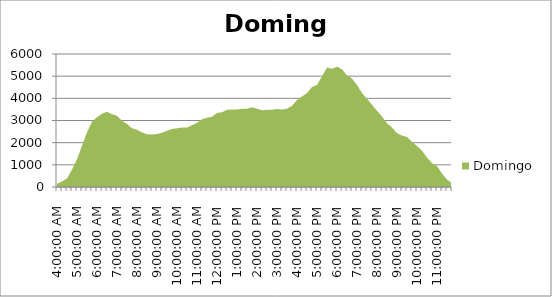
| Category | Domingo |
|---|---|
| 0.16666666666666663 | 151 |
| 0.1770833333333333 | 248 |
| 0.18749999999999994 | 382 |
| 0.1979166666666666 | 788 |
| 0.20833333333333326 | 1255 |
| 0.21874999999999992 | 1865 |
| 0.22916666666666657 | 2467 |
| 0.23958333333333323 | 2938 |
| 0.2499999999999999 | 3149 |
| 0.2604166666666666 | 3304 |
| 0.27083333333333326 | 3391 |
| 0.28124999999999994 | 3285 |
| 0.29166666666666663 | 3216 |
| 0.3020833333333333 | 2988 |
| 0.3125 | 2842 |
| 0.3229166666666667 | 2656 |
| 0.33333333333333337 | 2579 |
| 0.34375000000000006 | 2462 |
| 0.35416666666666674 | 2378 |
| 0.3645833333333334 | 2371 |
| 0.3750000000000001 | 2396 |
| 0.3854166666666668 | 2453 |
| 0.3958333333333335 | 2542 |
| 0.40625000000000017 | 2621 |
| 0.41666666666666685 | 2654 |
| 0.42708333333333354 | 2685 |
| 0.4375000000000002 | 2689 |
| 0.4479166666666669 | 2788 |
| 0.4583333333333336 | 2888 |
| 0.4687500000000003 | 3059 |
| 0.47916666666666696 | 3124 |
| 0.48958333333333365 | 3166 |
| 0.5000000000000003 | 3338 |
| 0.510416666666667 | 3377 |
| 0.5208333333333336 | 3480 |
| 0.5312500000000002 | 3499 |
| 0.5416666666666669 | 3491 |
| 0.5520833333333335 | 3534 |
| 0.5625000000000001 | 3528 |
| 0.5729166666666667 | 3599 |
| 0.5833333333333334 | 3534 |
| 0.59375 | 3467 |
| 0.6041666666666666 | 3483 |
| 0.6145833333333333 | 3483 |
| 0.6249999999999999 | 3514 |
| 0.6354166666666665 | 3501 |
| 0.6458333333333331 | 3534 |
| 0.6562499999999998 | 3663 |
| 0.6666666666666664 | 3926 |
| 0.677083333333333 | 4088 |
| 0.6874999999999997 | 4243 |
| 0.6979166666666663 | 4510 |
| 0.7083333333333329 | 4598 |
| 0.7187499999999996 | 4992 |
| 0.7291666666666662 | 5394 |
| 0.7395833333333328 | 5337 |
| 0.7499999999999994 | 5429 |
| 0.7604166666666661 | 5310 |
| 0.7708333333333327 | 5028 |
| 0.7812499999999993 | 4897 |
| 0.791666666666666 | 4597 |
| 0.8020833333333326 | 4236 |
| 0.8124999999999992 | 3983 |
| 0.8229166666666659 | 3715 |
| 0.8333333333333325 | 3435 |
| 0.8437499999999991 | 3182 |
| 0.8541666666666657 | 2876 |
| 0.8645833333333324 | 2680 |
| 0.874999999999999 | 2421 |
| 0.8854166666666656 | 2324 |
| 0.8958333333333323 | 2259 |
| 0.9062499999999989 | 2041 |
| 0.9166666666666655 | 1846 |
| 0.9270833333333321 | 1630 |
| 0.9374999999999988 | 1328 |
| 0.9479166666666654 | 1076 |
| 0.958333333333332 | 943 |
| 0.9687499999999987 | 612 |
| 0.9791666666666653 | 343 |
| 0.9895833333333319 | 162 |